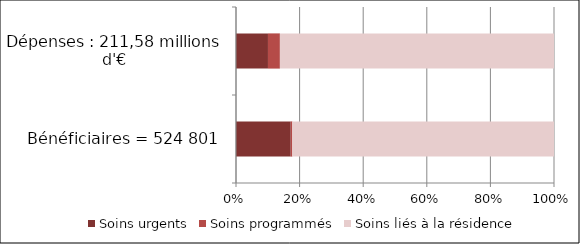
| Category | Soins urgents | Soins programmés | Soins liés à la résidence |
|---|---|---|---|
| Bénéficiaires = 524 801 | 90331 | 2595 | 431875 |
| Dépenses : 211,58 millions d'€ | 21267675.66 | 7940560.58 | 182372368.436 |